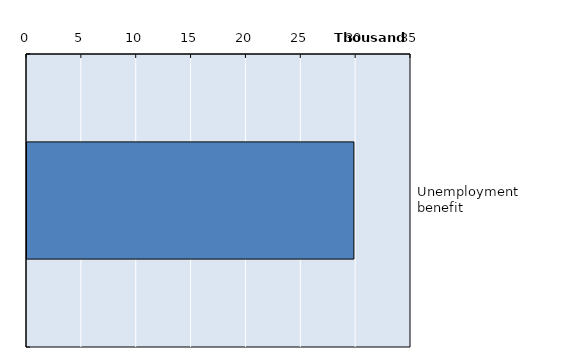
| Category | Series 0 |
|---|---|
| Unemployment benefit | 29795 |